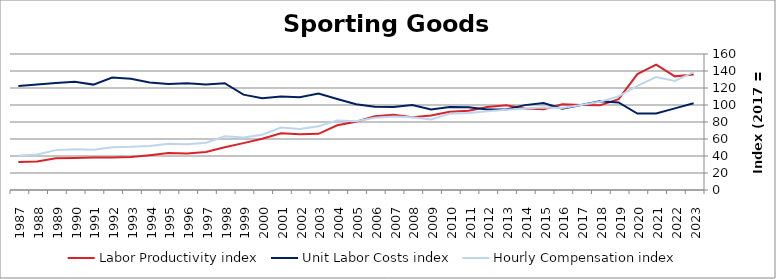
| Category | Labor Productivity index | Unit Labor Costs index | Hourly Compensation index |
|---|---|---|---|
| 2023.0 | 135.9 | 102.06 | 138.7 |
| 2022.0 | 133.691 | 96.044 | 128.402 |
| 2021.0 | 147.439 | 90.091 | 132.829 |
| 2020.0 | 136.305 | 89.963 | 122.624 |
| 2019.0 | 106.927 | 102.939 | 110.07 |
| 2018.0 | 99.593 | 104.316 | 103.892 |
| 2017.0 | 100 | 100 | 100 |
| 2016.0 | 100.736 | 95.697 | 96.402 |
| 2015.0 | 94.979 | 102.329 | 97.191 |
| 2014.0 | 95.956 | 99.85 | 95.812 |
| 2013.0 | 99.586 | 94.726 | 94.334 |
| 2012.0 | 97.738 | 94.719 | 92.576 |
| 2011.0 | 93.18 | 97.347 | 90.708 |
| 2010.0 | 91.996 | 97.642 | 89.826 |
| 2009.0 | 87.651 | 94.644 | 82.956 |
| 2008.0 | 85.532 | 99.945 | 85.485 |
| 2007.0 | 88.576 | 97.592 | 86.442 |
| 2006.0 | 86.783 | 97.84 | 84.909 |
| 2005.0 | 80.317 | 100.882 | 81.025 |
| 2004.0 | 76.214 | 107.144 | 81.659 |
| 2003.0 | 66.049 | 113.461 | 74.94 |
| 2002.0 | 65.678 | 109.131 | 71.676 |
| 2001.0 | 66.826 | 110.006 | 73.513 |
| 2000.0 | 60.347 | 107.829 | 65.072 |
| 1999.0 | 55.144 | 112.166 | 61.853 |
| 1998.0 | 50.359 | 125.651 | 63.277 |
| 1997.0 | 44.787 | 124.167 | 55.611 |
| 1996.0 | 42.894 | 125.443 | 53.807 |
| 1995.0 | 43.565 | 124.685 | 54.319 |
| 1994.0 | 40.962 | 126.543 | 51.834 |
| 1993.0 | 38.736 | 131.002 | 50.745 |
| 1992.0 | 38.144 | 132.207 | 50.429 |
| 1991.0 | 38.204 | 123.988 | 47.368 |
| 1990.0 | 37.654 | 127.343 | 47.95 |
| 1989.0 | 37.241 | 125.966 | 46.912 |
| 1988.0 | 33.586 | 124.11 | 41.684 |
| 1987.0 | 32.95 | 122.288 | 40.294 |